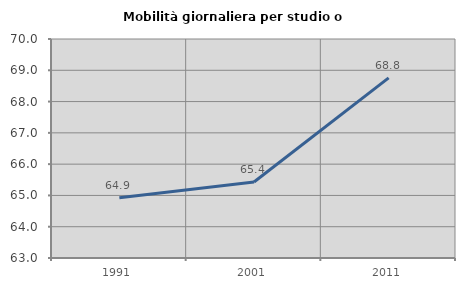
| Category | Mobilità giornaliera per studio o lavoro |
|---|---|
| 1991.0 | 64.927 |
| 2001.0 | 65.43 |
| 2011.0 | 68.758 |